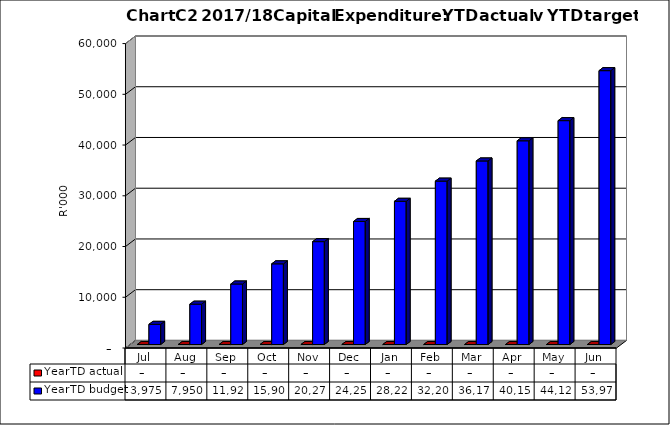
| Category | YearTD actual | YearTD budget |
|---|---|---|
| Jul | 0 | 3975000 |
| Aug | 0 | 7950000 |
| Sep | 0 | 11925000 |
| Oct | 0 | 15900000 |
| Nov | 0 | 20275000 |
| Dec | 0 | 24250000 |
| Jan | 0 | 28225000 |
| Feb | 0 | 32200000 |
| Mar | 0 | 36175000 |
| Apr | 0 | 40150000 |
| May | 0 | 44125000 |
| Jun | 0 | 53976000 |